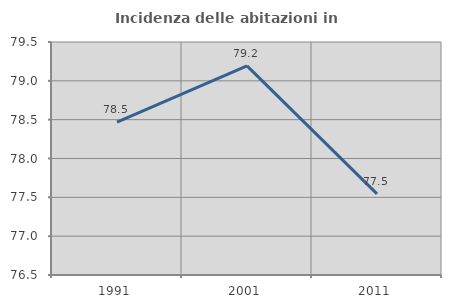
| Category | Incidenza delle abitazioni in proprietà  |
|---|---|
| 1991.0 | 78.467 |
| 2001.0 | 79.193 |
| 2011.0 | 77.545 |